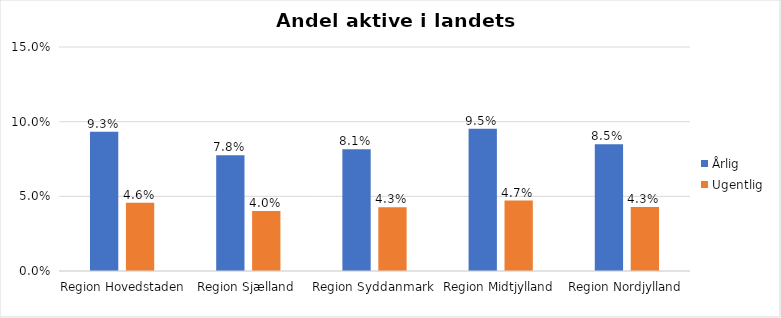
| Category | Årlig | Ugentlig |
|---|---|---|
| Region Hovedstaden | 0.093 | 0.046 |
| Region Sjælland | 0.078 | 0.04 |
| Region Syddanmark | 0.081 | 0.043 |
| Region Midtjylland | 0.095 | 0.047 |
| Region Nordjylland | 0.085 | 0.043 |